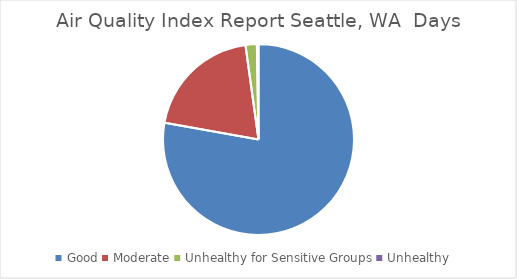
| Category | Air Quality Index Report |
|---|---|
| Good | 0.778 |
| Moderate | 0.2 |
| Unhealthy for Sensitive Groups | 0.019 |
| Unhealthy | 0.003 |